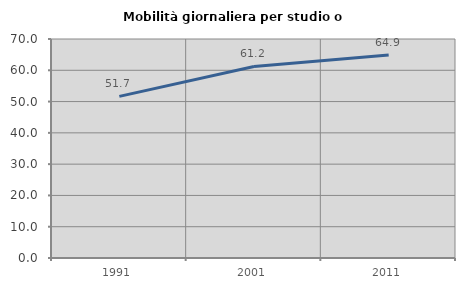
| Category | Mobilità giornaliera per studio o lavoro |
|---|---|
| 1991.0 | 51.668 |
| 2001.0 | 61.213 |
| 2011.0 | 64.881 |